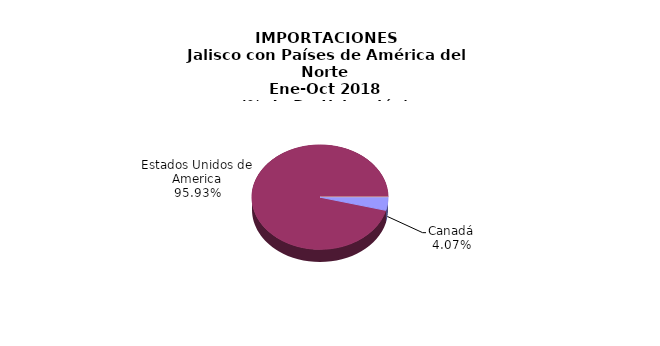
| Category | IMPORTACIONES |
|---|---|
| Canadá | 1080.993 |
| Estados Unidos de America | 25506.358 |
| Otros | 0 |